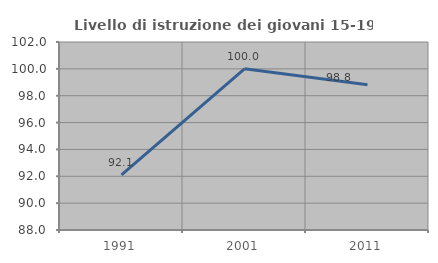
| Category | Livello di istruzione dei giovani 15-19 anni |
|---|---|
| 1991.0 | 92.105 |
| 2001.0 | 100 |
| 2011.0 | 98.81 |